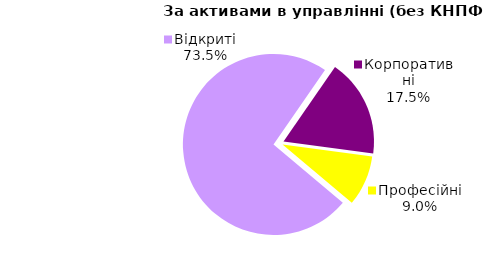
| Category | Series 0 |
|---|---|
| Відкриті | 1139.809 |
| Корпоративні | 270.715 |
| Професійні | 139.749 |